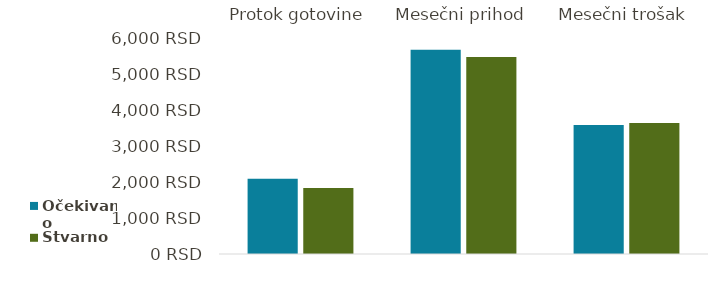
| Category | Očekivano | Stvarno |
|---|---|---|
| Protok gotovine | 2097 | 1845 |
| Mesečni prihod | 5700 | 5500 |
| Mesečni trošak | 3603 | 3655 |